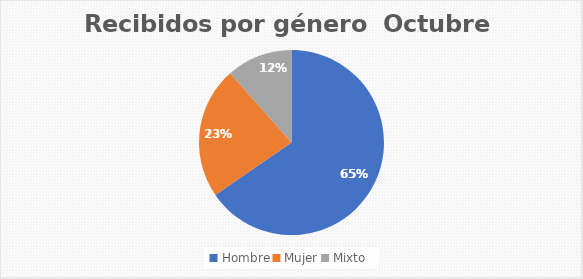
| Category | Recibidos por género  Cantidad |
|---|---|
| Hombre | 17 |
| Mujer | 6 |
| Mixto | 3 |